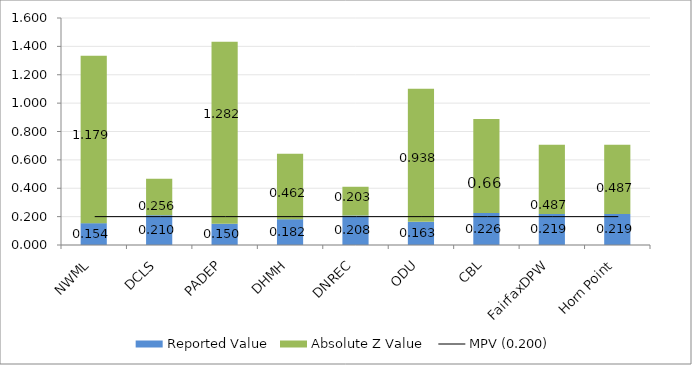
| Category | Reported Value | Absolute Z Value  |
|---|---|---|
| NWML | 0.154 | 1.179 |
| DCLS | 0.21 | 0.256 |
| PADEP | 0.15 | 1.282 |
| DHMH | 0.182 | 0.462 |
| DNREC | 0.208 | 0.203 |
| ODU | 0.163 | 0.938 |
| CBL | 0.226 | 0.662 |
| FairfaxDPW | 0.219 | 0.487 |
| Horn Point | 0.219 | 0.487 |